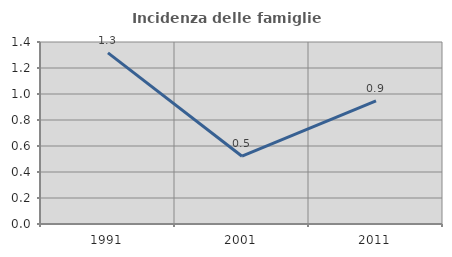
| Category | Incidenza delle famiglie numerose |
|---|---|
| 1991.0 | 1.317 |
| 2001.0 | 0.521 |
| 2011.0 | 0.947 |